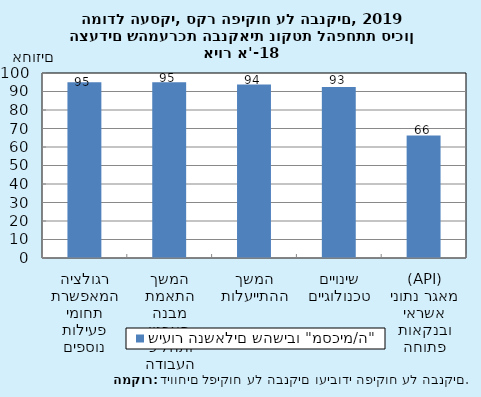
| Category | שיעור הנשאלים שהשיבו "מסכימ/ה" |
|---|---|
| רגולציה המאפשרת תחומי פעילות נוספים | 95 |
| המשך התאמת מבנה הארגון ותהליכי העבודה | 95 |
| המשך ההתייעלות | 93.75 |
| שינויים טכנולוגיים | 92.5 |
| מאגר נתוני אשראי ובנקאות פתוחה (API) | 66.25 |